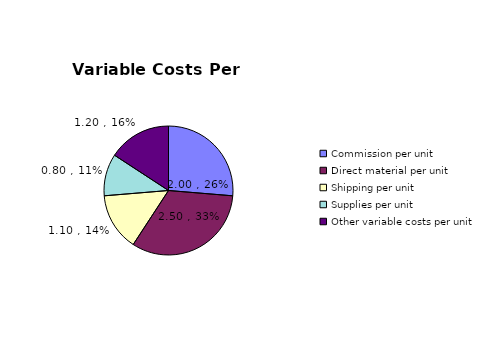
| Category | Series 0 |
|---|---|
| Commission per unit | 2 |
| Direct material per unit | 2.5 |
| Shipping per unit | 1.1 |
| Supplies per unit | 0.8 |
| Other variable costs per unit | 1.2 |